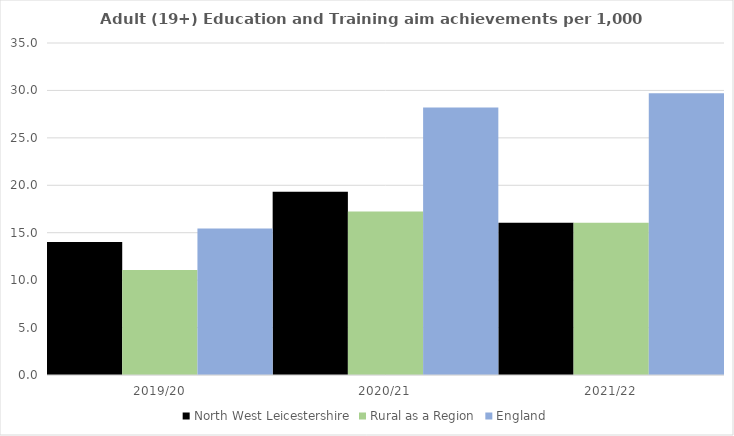
| Category | North West Leicestershire | Rural as a Region | England |
|---|---|---|---|
| 2019/20 | 14.01 | 11.081 | 15.446 |
| 2020/21 | 19.307 | 17.224 | 28.211 |
| 2021/22 | 16.054 | 16.063 | 29.711 |